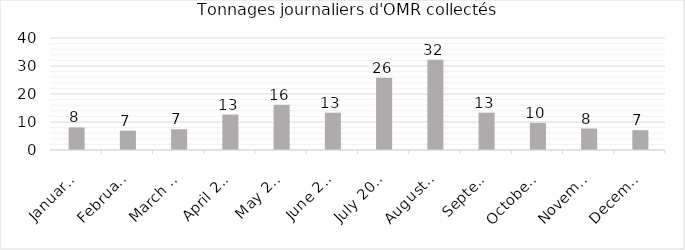
| Category | Series 1 |
|---|---|
| 2020-01-01 | 8.065 |
| 2020-02-01 | 6.897 |
| 2020-03-01 | 7.419 |
| 2020-04-01 | 12.667 |
| 2020-05-01 | 16.129 |
| 2020-06-01 | 13.33 |
| 2020-07-01 | 25.806 |
| 2020-08-01 | 32.258 |
| 2020-09-01 | 13.333 |
| 2020-10-01 | 9.677 |
| 2020-11-01 | 7.667 |
| 2020-12-01 | 7.097 |